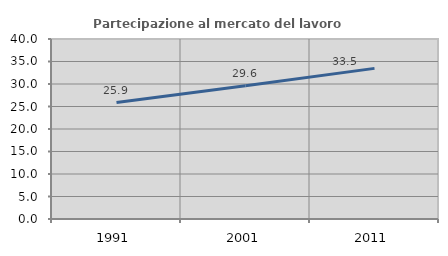
| Category | Partecipazione al mercato del lavoro  femminile |
|---|---|
| 1991.0 | 25.87 |
| 2001.0 | 29.614 |
| 2011.0 | 33.475 |